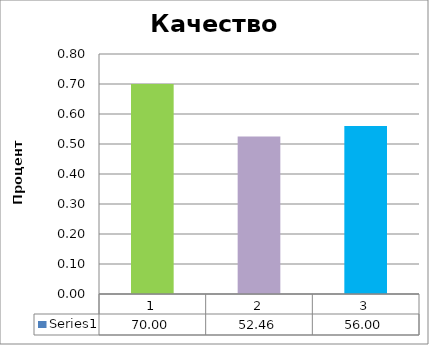
| Category | Series 0 |
|---|---|
| 0 | 70 |
| 1 | 52.459 |
| 2 | 56 |